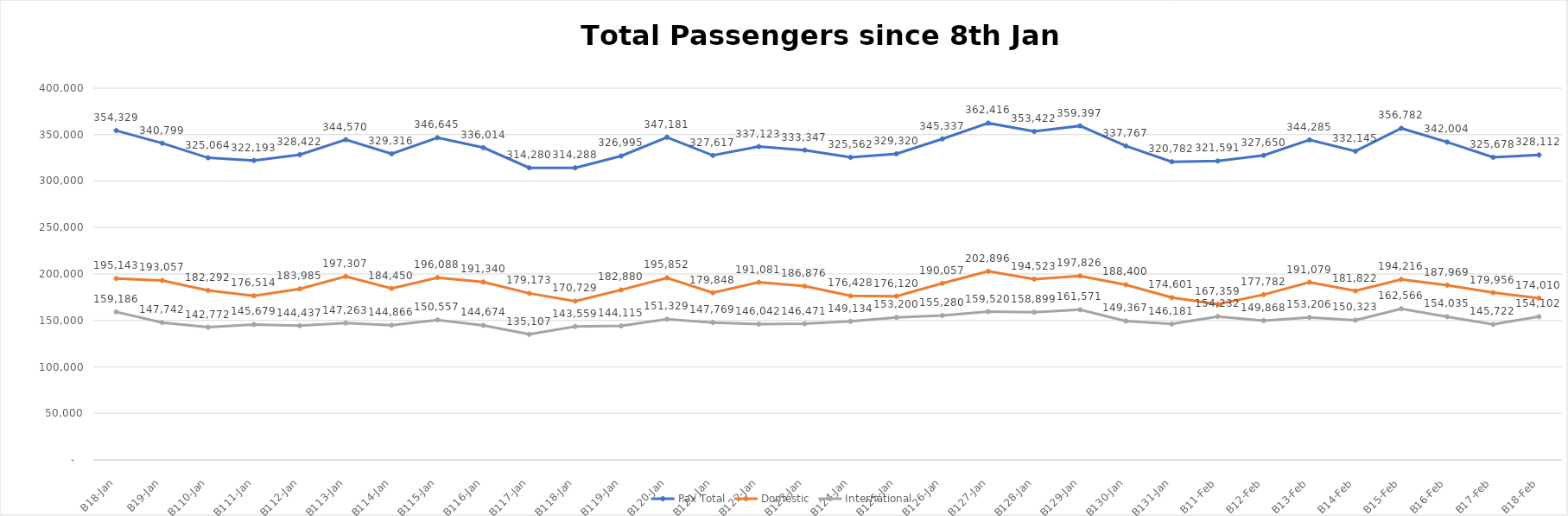
| Category | Pax Total |  Domestic  |  International  |
|---|---|---|---|
| 2023-01-08 | 354329 | 195143 | 159186 |
| 2023-01-09 | 340799 | 193057 | 147742 |
| 2023-01-10 | 325064 | 182292 | 142772 |
| 2023-01-11 | 322193 | 176514 | 145679 |
| 2023-01-12 | 328422 | 183985 | 144437 |
| 2023-01-13 | 344570 | 197307 | 147263 |
| 2023-01-14 | 329316 | 184450 | 144866 |
| 2023-01-15 | 346645 | 196088 | 150557 |
| 2023-01-16 | 336014 | 191340 | 144674 |
| 2023-01-17 | 314280 | 179173 | 135107 |
| 2023-01-18 | 314288 | 170729 | 143559 |
| 2023-01-19 | 326995 | 182880 | 144115 |
| 2023-01-20 | 347181 | 195852 | 151329 |
| 2023-01-21 | 327617 | 179848 | 147769 |
| 2023-01-22 | 337123 | 191081 | 146042 |
| 2023-01-23 | 333347 | 186876 | 146471 |
| 2023-01-24 | 325562 | 176428 | 149134 |
| 2023-01-25 | 329320 | 176120 | 153200 |
| 2023-01-26 | 345337 | 190057 | 155280 |
| 2023-01-27 | 362416 | 202896 | 159520 |
| 2023-01-28 | 353422 | 194523 | 158899 |
| 2023-01-29 | 359397 | 197826 | 161571 |
| 2023-01-30 | 337767 | 188400 | 149367 |
| 2023-01-31 | 320782 | 174601 | 146181 |
| 2023-02-01 | 321591 | 167359 | 154232 |
| 2023-02-02 | 327650 | 177782 | 149868 |
| 2023-02-03 | 344285 | 191079 | 153206 |
| 2023-02-04 | 332145 | 181822 | 150323 |
| 2023-02-05 | 356782 | 194216 | 162566 |
| 2023-02-06 | 342004 | 187969 | 154035 |
| 2023-02-07 | 325678 | 179956 | 145722 |
| 2023-02-08 | 328112 | 174010 | 154102 |